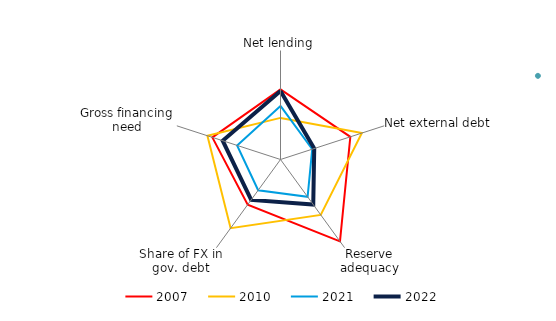
| Category | 2007 | 2008 | 2010 | 2021 | 2022 |
|---|---|---|---|---|---|
| Net lending | 0.86 | 6.407 | -0.71 | -0.051 | 0.776 |
| Net external debt | 1.042 | 11.899 | 1.71 | -1.163 | -1.048 |
| Reserve adequacy | 2.571 | 44.448 | 0.768 | -0.462 | 0.067 |
| Share of FX in gov. debt | 0.071 | 40.066 | 1.672 | -0.908 | -0.253 |
| Gross financing need | 0.945 | 34.692 | 1.23 | -0.489 | 0.346 |